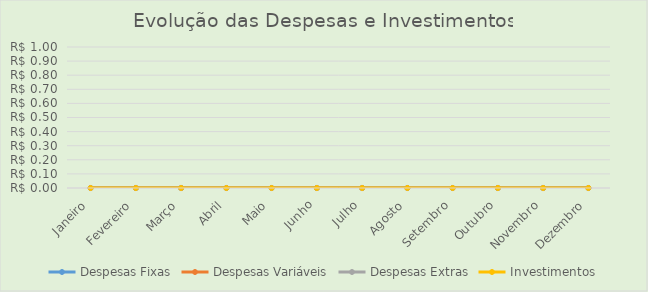
| Category | Despesas Fixas | Despesas Variáveis | Despesas Extras | Investimentos |
|---|---|---|---|---|
| Janeiro | 0 | 0 | 0 | 0 |
| Fevereiro | 0 | 0 | 0 | 0 |
| Março | 0 | 0 | 0 | 0 |
| Abril | 0 | 0 | 0 | 0 |
| Maio | 0 | 0 | 0 | 0 |
| Junho | 0 | 0 | 0 | 0 |
| Julho | 0 | 0 | 0 | 0 |
| Agosto | 0 | 0 | 0 | 0 |
| Setembro | 0 | 0 | 0 | 0 |
| Outubro | 0 | 0 | 0 | 0 |
| Novembro | 0 | 0 | 0 | 0 |
| Dezembro | 0 | 0 | 0 | 0 |